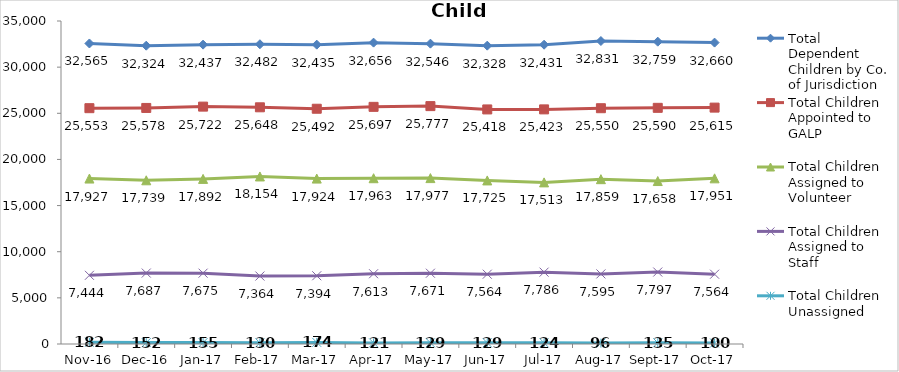
| Category | Total Dependent Children by Co. of Jurisdiction | Total Children Appointed to GALP | Total Children Assigned to Volunteer | Total Children Assigned to Staff | Total Children Unassigned |
|---|---|---|---|---|---|
| 2016-11-01 | 32565 | 25553 | 17927 | 7444 | 182 |
| 2016-12-01 | 32324 | 25578 | 17739 | 7687 | 152 |
| 2017-01-01 | 32437 | 25722 | 17892 | 7675 | 155 |
| 2017-02-01 | 32482 | 25648 | 18154 | 7364 | 130 |
| 2017-03-01 | 32435 | 25492 | 17924 | 7394 | 174 |
| 2017-04-01 | 32656 | 25697 | 17963 | 7613 | 121 |
| 2017-05-01 | 32546 | 25777 | 17977 | 7671 | 129 |
| 2017-06-01 | 32328 | 25418 | 17725 | 7564 | 129 |
| 2017-07-01 | 32431 | 25423 | 17513 | 7786 | 124 |
| 2017-08-01 | 32831 | 25550 | 17859 | 7595 | 96 |
| 2017-09-01 | 32759 | 25590 | 17658 | 7797 | 135 |
| 2017-10-01 | 32660 | 25615 | 17951 | 7564 | 100 |